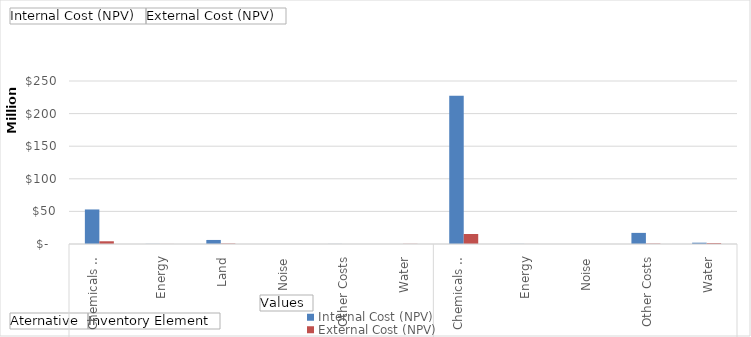
| Category | Internal Cost (NPV) | External Cost (NPV) |
|---|---|---|
| 0 | 52980774.509 | 4174569.934 |
| 1 | 185104.196 | 77620.566 |
| 2 | 6205202.312 | 676574.094 |
| 3 | 0 | 2319.444 |
| 4 | 122244.994 | 9995.658 |
| 5 | 18984.335 | 239083.714 |
| 6 | 227276328.691 | 15315331.592 |
| 7 | 180547.726 | 68216.353 |
| 8 | 0 | 9166.334 |
| 9 | 17041935.184 | 608493.501 |
| 10 | 2013522.537 | 1368854.721 |